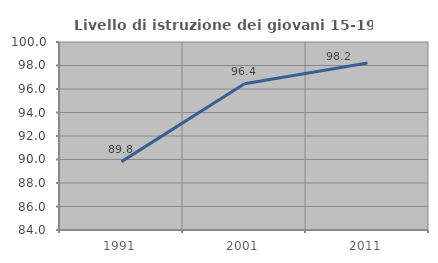
| Category | Livello di istruzione dei giovani 15-19 anni |
|---|---|
| 1991.0 | 89.819 |
| 2001.0 | 96.438 |
| 2011.0 | 98.212 |